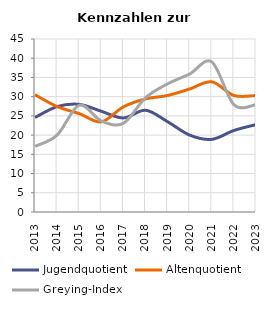
| Category | Jugendquotient | Altenquotient | Greying-Index |
|---|---|---|---|
| 2013.0 | 24.576 | 30.508 | 17.073 |
| 2014.0 | 27.419 | 27.419 | 20 |
| 2015.0 | 28 | 25.6 | 27.778 |
| 2016.0 | 26.207 | 23.448 | 23.684 |
| 2017.0 | 24.46 | 27.338 | 23.077 |
| 2018.0 | 26.471 | 29.412 | 29.73 |
| 2019.0 | 23.485 | 30.303 | 33.333 |
| 2020.0 | 20 | 32 | 35.9 |
| 2021.0 | 18.898 | 33.858 | 39.024 |
| 2022.0 | 21.21 | 30.3 | 27.91 |
| 2023.0 | 22.727 | 30.303 | 27.907 |